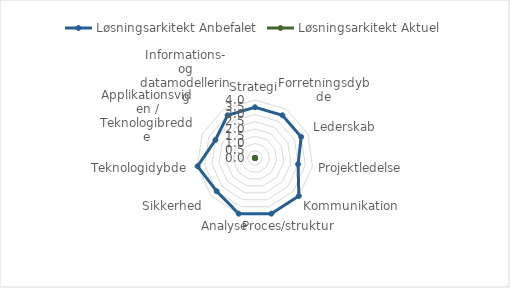
| Category | Løsningsarkitekt |
|---|---|
| Strategi |  |
| Forretningsdybde |  |
| Lederskab |  |
| Projektledelse |  |
| Kommunikation |  |
| Proces/struktur |  |
| Analyse |  |
| Sikkerhed |  |
| Teknologidybde |  |
| Applikationsviden / Teknologibredde |  |
| Informations- og datamodellering |  |